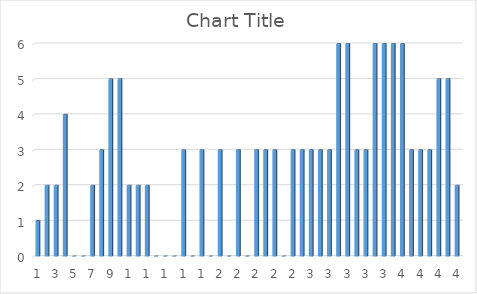
| Category | Series 0 |
|---|---|
| 0 | 1 |
| 1 | 2 |
| 2 | 2 |
| 3 | 4 |
| 4 | 0 |
| 5 | 0 |
| 6 | 2 |
| 7 | 3 |
| 8 | 5 |
| 9 | 5 |
| 10 | 2 |
| 11 | 2 |
| 12 | 2 |
| 13 | 0 |
| 14 | 0 |
| 15 | 0 |
| 16 | 3 |
| 17 | 0 |
| 18 | 3 |
| 19 | 0 |
| 20 | 3 |
| 21 | 0 |
| 22 | 3 |
| 23 | 0 |
| 24 | 3 |
| 25 | 3 |
| 26 | 3 |
| 27 | 0 |
| 28 | 3 |
| 29 | 3 |
| 30 | 3 |
| 31 | 3 |
| 32 | 3 |
| 33 | 6 |
| 34 | 6 |
| 35 | 3 |
| 36 | 3 |
| 37 | 6 |
| 38 | 6 |
| 39 | 6 |
| 40 | 6 |
| 41 | 3 |
| 42 | 3 |
| 43 | 3 |
| 44 | 5 |
| 45 | 5 |
| 46 | 2 |